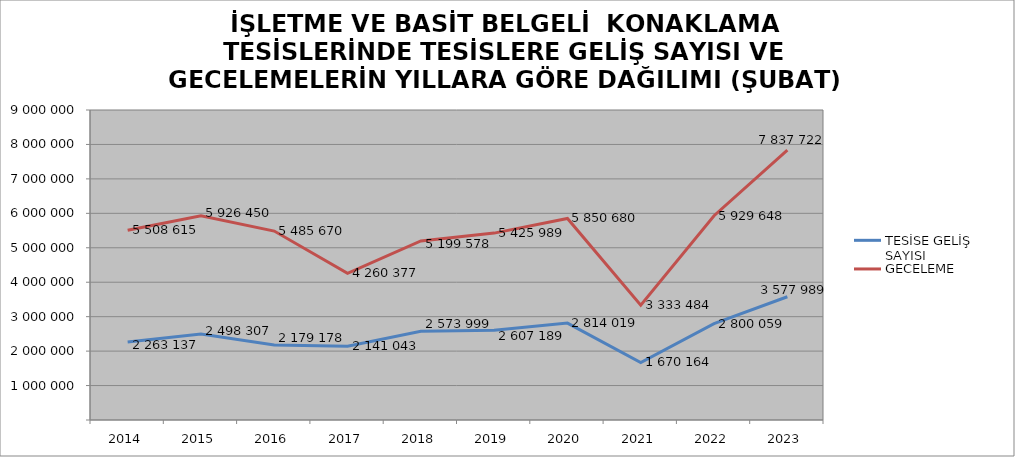
| Category | TESİSE GELİŞ SAYISI | GECELEME |
|---|---|---|
| 2014 | 2263137 | 5508615 |
| 2015 | 2498307 | 5926450 |
| 2016 | 2179178 | 5485670 |
| 2017 | 2141043 | 4260377 |
| 2018 | 2573999 | 5199578 |
| 2019 | 2607189 | 5425989 |
| 2020 | 2814019 | 5850680 |
| 2021 | 1670164 | 3333484 |
| 2022 | 2800059 | 5929648 |
| 2023 | 3577989 | 7837722 |